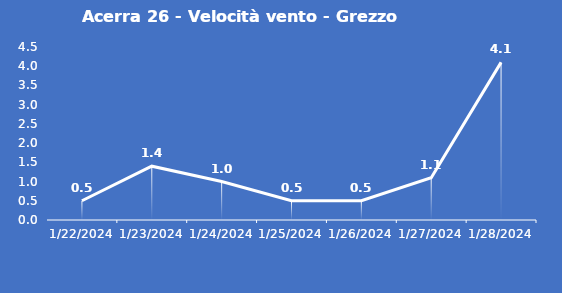
| Category | Acerra 26 - Velocità vento - Grezzo (m/s) |
|---|---|
| 1/22/24 | 0.5 |
| 1/23/24 | 1.4 |
| 1/24/24 | 1 |
| 1/25/24 | 0.5 |
| 1/26/24 | 0.5 |
| 1/27/24 | 1.1 |
| 1/28/24 | 4.1 |